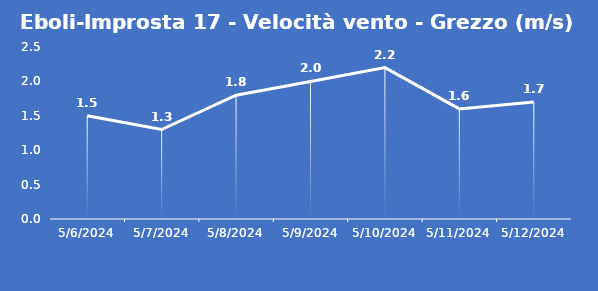
| Category | Eboli-Improsta 17 - Velocità vento - Grezzo (m/s) |
|---|---|
| 5/6/24 | 1.5 |
| 5/7/24 | 1.3 |
| 5/8/24 | 1.8 |
| 5/9/24 | 2 |
| 5/10/24 | 2.2 |
| 5/11/24 | 1.6 |
| 5/12/24 | 1.7 |